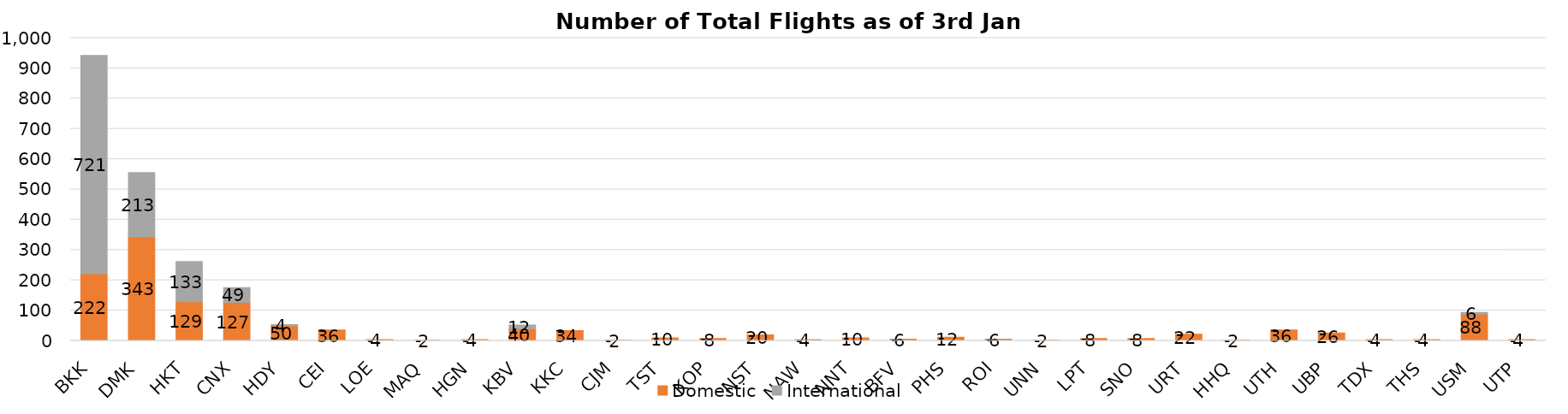
| Category | Domestic | International |
|---|---|---|
| BKK | 222 | 721 |
| DMK | 343 | 213 |
| HKT | 129 | 133 |
| CNX | 127 | 49 |
| HDY | 50 | 4 |
| CEI | 36 | 0 |
| LOE | 4 | 0 |
| MAQ | 2 | 0 |
| HGN | 4 | 0 |
| KBV | 40 | 12 |
| KKC | 34 | 0 |
| CJM | 2 | 0 |
| TST | 10 | 0 |
| KOP | 8 | 0 |
| NST | 20 | 0 |
| NAW | 4 | 0 |
| NNT | 10 | 0 |
| BFV | 6 | 0 |
| PHS | 12 | 0 |
| ROI | 6 | 0 |
| UNN | 2 | 0 |
| LPT | 8 | 0 |
| SNO | 8 | 0 |
| URT | 22 | 0 |
| HHQ | 2 | 0 |
| UTH | 36 | 0 |
| UBP | 26 | 0 |
| TDX | 4 | 0 |
| THS | 4 | 0 |
| USM | 88 | 6 |
| UTP | 4 | 0 |